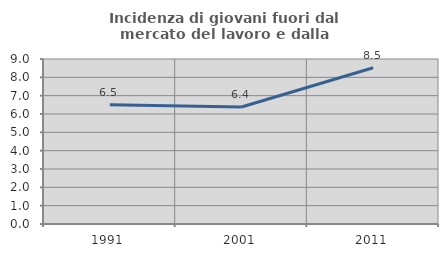
| Category | Incidenza di giovani fuori dal mercato del lavoro e dalla formazione  |
|---|---|
| 1991.0 | 6.504 |
| 2001.0 | 6.384 |
| 2011.0 | 8.521 |